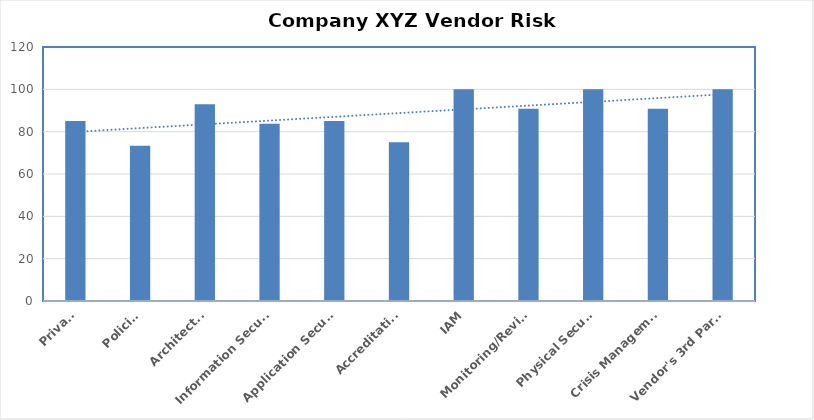
| Category | Series 0 |
|---|---|
| Privacy | 85 |
| Policies | 73.333 |
| Architecture | 92.941 |
| Information Security | 83.75 |
| Application Security | 85 |
| Accreditation | 75 |
| IAM | 100 |
| Monitoring/Reviews | 90.769 |
| Physical Security | 100 |
| Crisis Management | 90.769 |
| Vendor's 3rd Parties | 100 |